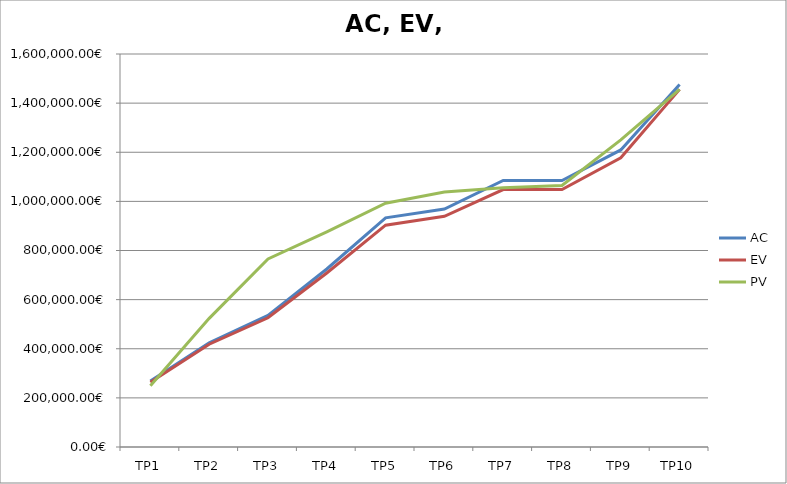
| Category | AC | EV | PV |
|---|---|---|---|
| TP1 | 268491.572 | 263831.579 | 249628.164 |
| TP2 | 424560.24 | 418322.173 | 523799.688 |
| TP3 | 535564.209 | 526138.567 | 765480.825 |
| TP4 | 724799.353 | 708316.4 | 875862.019 |
| TP5 | 932866.585 | 903141.565 | 992375.502 |
| TP6 | 969034.149 | 939204.718 | 1038564.519 |
| TP7 | 1085156.4 | 1048260 | 1055178.583 |
| TP8 | 1085156.4 | 1048260 | 1064801.597 |
| TP9 | 1209390 | 1177400 | 1250550.926 |
| TP10 | 1476290 | 1456000 | 1456000 |